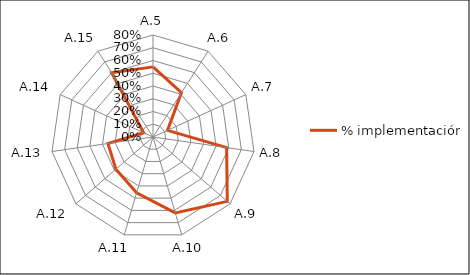
| Category | % implementación | Máx |
|---|---|---|
| A.5 | 0.55 |  |
| A.6 | 0.412 |  |
| A.7 | 0.125 |  |
| A.8 | 0.583 |  |
| A.9 | 0.771 |  |
| A.10 | 0.62 |  |
| A.11 | 0.457 |  |
| A.12 | 0.385 |  |
| A.13 | 0.357 |  |
| A.14 | 0.08 |  |
| A.15 | 0.6 |  |